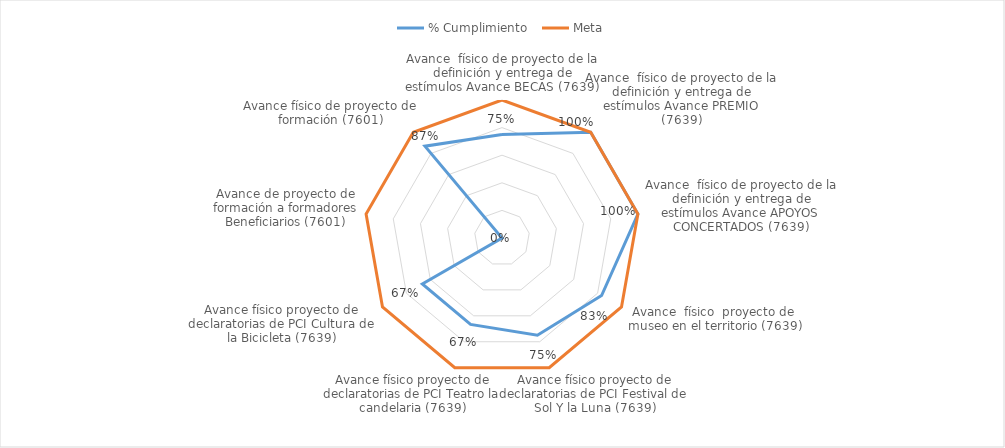
| Category | % Cumplimiento  | Meta |
|---|---|---|
| Avance  físico de proyecto de la definición y entrega de estímulos Avance BECAS (7639) | 0.75 | 1 |
| Avance  físico de proyecto de la definición y entrega de estímulos Avance PREMIO (7639) | 1 | 1 |
| Avance  físico de proyecto de la definición y entrega de estímulos Avance APOYOS CONCERTADOS (7639) | 1 | 1 |
| Avance  físico  proyecto de  museo en el territorio (7639) | 0.833 | 1 |
| Avance físico proyecto de declaratorias de PCI Festival de Sol Y la Luna (7639) | 0.75 | 1 |
| Avance físico proyecto de declaratorias de PCI Teatro la candelaria (7639) | 0.667 | 1 |
| Avance físico proyecto de declaratorias de PCI Cultura de la Bicicleta (7639) | 0.667 | 1 |
| Avance de proyecto de formación a formadores Beneficiarios (7601) | 0 | 1 |
| Avance físico de proyecto de formación (7601) | 0.869 | 1 |